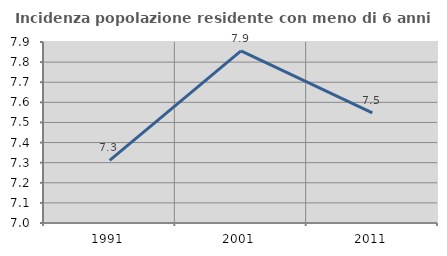
| Category | Incidenza popolazione residente con meno di 6 anni |
|---|---|
| 1991.0 | 7.311 |
| 2001.0 | 7.856 |
| 2011.0 | 7.548 |